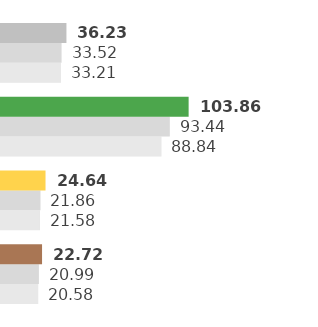
| Category | 2018 | 2019 | 2020 |
|---|---|---|---|
| Olio di colza | 20.582 | 20.987 | 22.722 |
| Olio di girasole | 21.58 | 21.863 | 24.641 |
| Olio d'oliva | 88.836 | 93.436 | 103.857 |
| Altri | 33.211 | 33.52 | 36.225 |